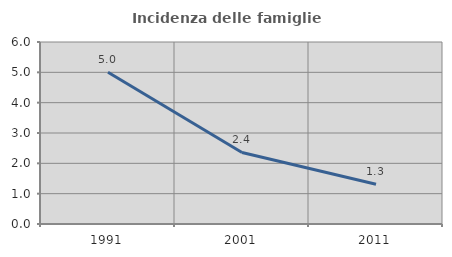
| Category | Incidenza delle famiglie numerose |
|---|---|
| 1991.0 | 5.005 |
| 2001.0 | 2.358 |
| 2011.0 | 1.312 |